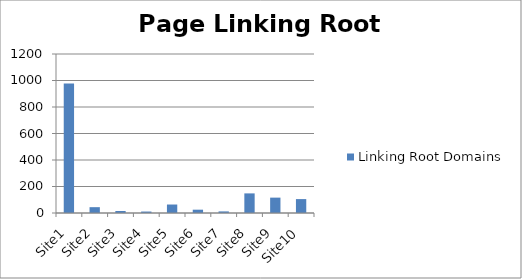
| Category | Linking Root Domains |
|---|---|
| Site1 | 978 |
| Site2 | 44 |
| Site3 | 15 |
| Site4 | 11 |
| Site5 | 64 |
| Site6 | 25 |
| Site7 | 12 |
| Site8 | 148 |
| Site9 | 116 |
| Site10 | 105 |